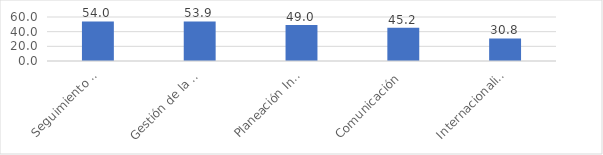
| Category | Series 0 |
|---|---|
| Seguimiento y Control | 54 |
| Gestión de la Calidad | 53.9 |
| Planeación Institucional | 49 |
| Comunicación | 45.2 |
| Internacionalización | 30.8 |